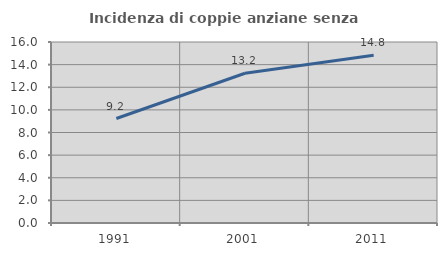
| Category | Incidenza di coppie anziane senza figli  |
|---|---|
| 1991.0 | 9.235 |
| 2001.0 | 13.241 |
| 2011.0 | 14.831 |